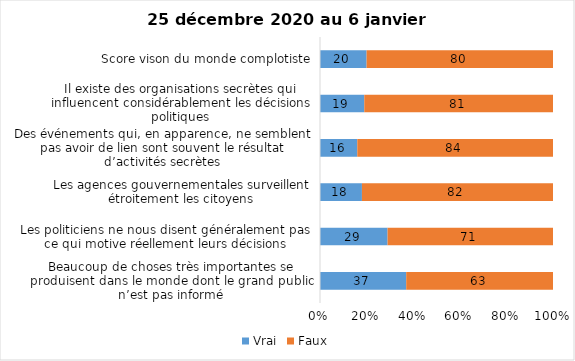
| Category | Vrai | Faux |
|---|---|---|
| Beaucoup de choses très importantes se produisent dans le monde dont le grand public n’est pas informé | 37 | 63 |
| Les politiciens ne nous disent généralement pas ce qui motive réellement leurs décisions | 29 | 71 |
| Les agences gouvernementales surveillent étroitement les citoyens | 18 | 82 |
| Des événements qui, en apparence, ne semblent pas avoir de lien sont souvent le résultat d’activités secrètes | 16 | 84 |
| Il existe des organisations secrètes qui influencent considérablement les décisions politiques | 19 | 81 |
| Score vison du monde complotiste | 20 | 80 |